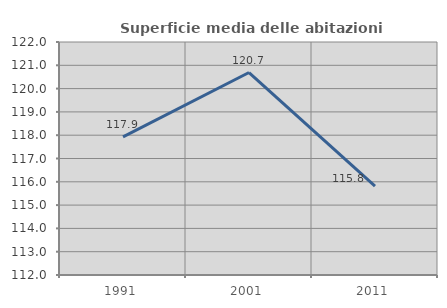
| Category | Superficie media delle abitazioni occupate |
|---|---|
| 1991.0 | 117.928 |
| 2001.0 | 120.69 |
| 2011.0 | 115.813 |